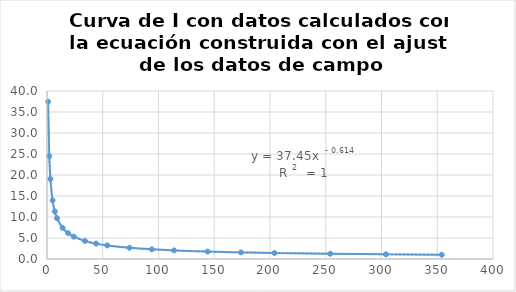
| Category | Series 0 |
|---|---|
| 1.0 | 37.45 |
| 2.0 | 24.469 |
| 3.0 | 19.077 |
| 5.0 | 13.941 |
| 7.0 | 11.339 |
| 9.0 | 9.717 |
| 14.0 | 7.408 |
| 19.0 | 6.142 |
| 24.0 | 5.321 |
| 34.0 | 4.297 |
| 44.0 | 3.668 |
| 54.0 | 3.234 |
| 74.0 | 2.665 |
| 94.0 | 2.301 |
| 114.0 | 2.044 |
| 144.0 | 1.771 |
| 174.0 | 1.577 |
| 204.0 | 1.43 |
| 254.0 | 1.25 |
| 304.0 | 1.119 |
| 354.0 | 1.019 |